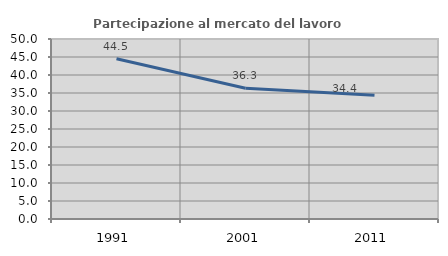
| Category | Partecipazione al mercato del lavoro  femminile |
|---|---|
| 1991.0 | 44.5 |
| 2001.0 | 36.313 |
| 2011.0 | 34.356 |